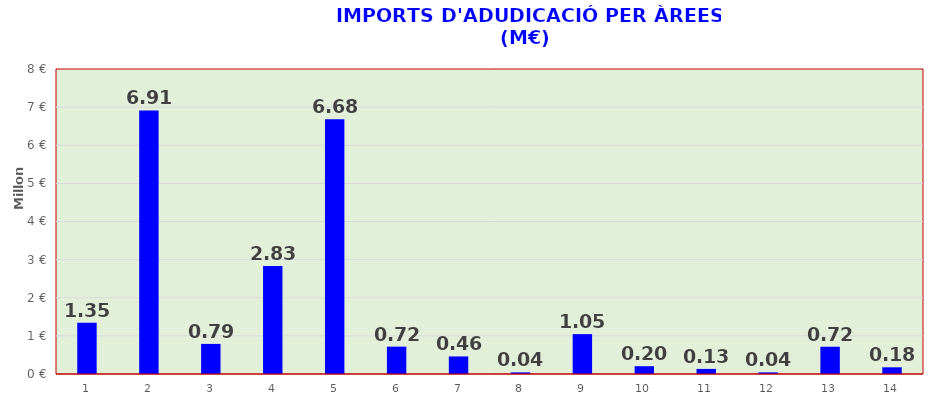
| Category | Series 0 |
|---|---|
| 0 | 1346789.12 |
| 1 | 6911530.79 |
| 2 | 789460.12 |
| 3 | 2831501.62 |
| 4 | 6684099.86 |
| 5 | 717530.31 |
| 6 | 460412.71 |
| 7 | 42701.17 |
| 8 | 1046130.03 |
| 9 | 204773.87 |
| 10 | 133313.49 |
| 11 | 42621.79 |
| 12 | 715178.27 |
| 13 | 175560.47 |